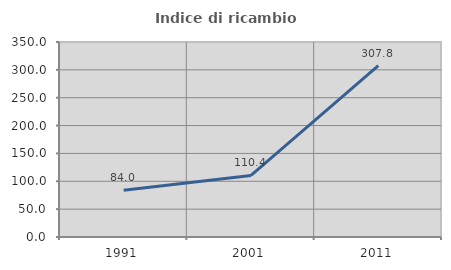
| Category | Indice di ricambio occupazionale  |
|---|---|
| 1991.0 | 84.028 |
| 2001.0 | 110.448 |
| 2011.0 | 307.792 |